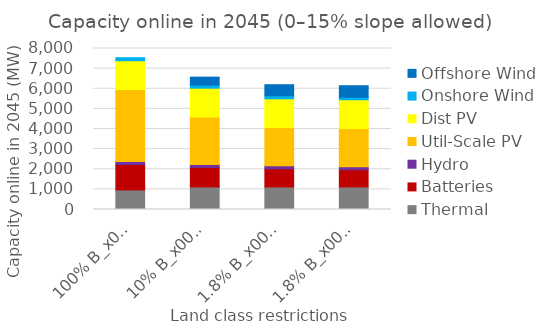
| Category | Thermal | Batteries | Hydro | Util-Scale PV | Dist PV | Onshore Wind | Offshore Wind |
|---|---|---|---|---|---|---|---|
| 100% B_x000d_100% C | 972.926 | 1261.953 | 150 | 3575.632 | 1432.455 | 150 | 0 |
| 10% B_x000d_10% C | 1123.512 | 965.604 | 150 | 2356.245 | 1432.455 | 150 | 400 |
| 1.8% B_x000d_1.1% C | 1123.512 | 897.263 | 150 | 1898.006 | 1432.455 | 150 | 548.792 |
| 1.8% B_x000d_1.1% C_x000d_no new wind | 1123.512 | 848.788 | 150 | 1899.487 | 1432.455 | 123 | 572.709 |